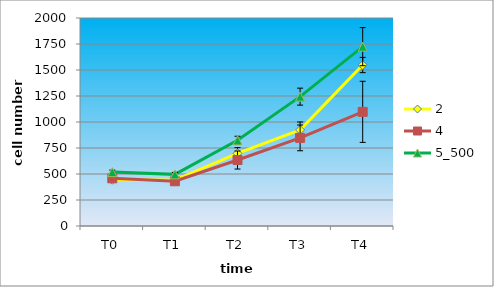
| Category | 2 | 4 | 5_500 |
|---|---|---|---|
| T0 | 444.889 | 458.222 | 518.222 |
| T1 | 442.222 | 430 | 496.444 |
| T2 | 698.333 | 634.444 | 823.889 |
| T3 | 923.889 | 847.222 | 1243.889 |
| T4 | 1547.778 | 1097.778 | 1724.444 |